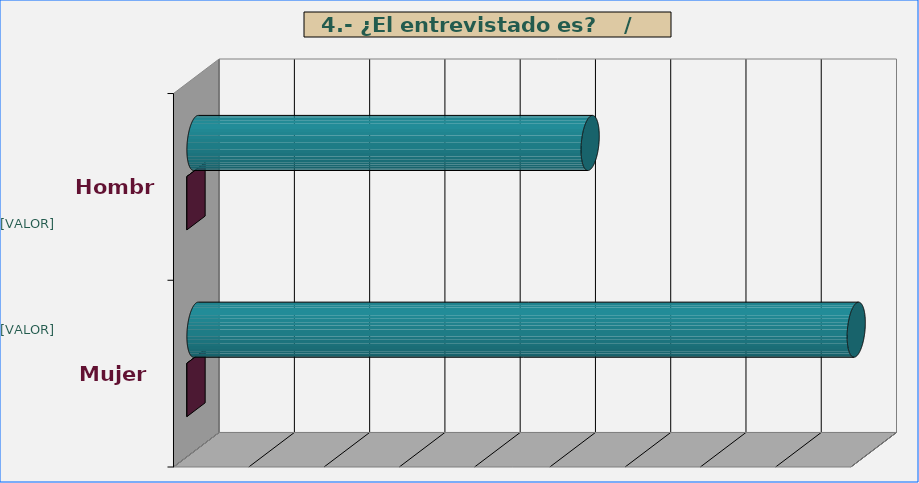
| Category | Series 0 | Series 1 |
|---|---|---|
| Hombre | 5237 | 0.374 |
| Mujer | 8772 | 0.626 |